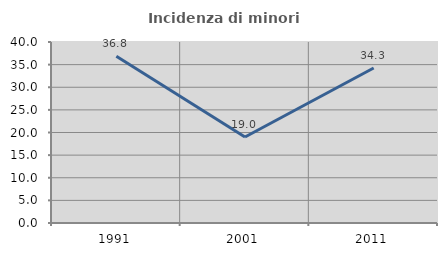
| Category | Incidenza di minori stranieri |
|---|---|
| 1991.0 | 36.842 |
| 2001.0 | 19.008 |
| 2011.0 | 34.259 |